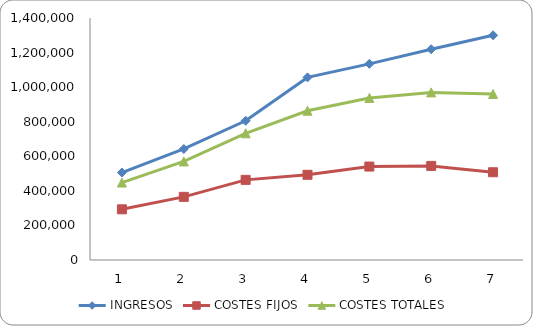
| Category | INGRESOS | COSTES FIJOS | COSTES TOTALES |
|---|---|---|---|
| 1.0 | 506000 | 293164.4 | 448084.4 |
| 2.0 | 642259.875 | 365280.4 | 570106.56 |
| 3.0 | 805522.54 | 463619.259 | 733176.585 |
| 4.0 | 1056336.379 | 492911.051 | 863616.077 |
| 5.0 | 1134633.567 | 540534.389 | 937566.569 |
| 6.0 | 1219228.777 | 544280.794 | 969695.076 |
| 7.0 | 1300081.603 | 507652.859 | 960410.683 |